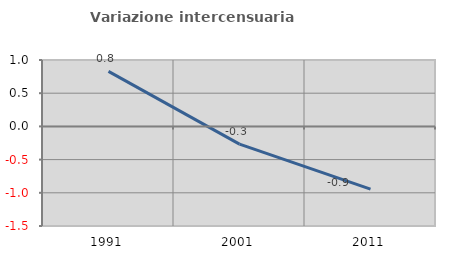
| Category | Variazione intercensuaria annua |
|---|---|
| 1991.0 | 0.83 |
| 2001.0 | -0.268 |
| 2011.0 | -0.944 |